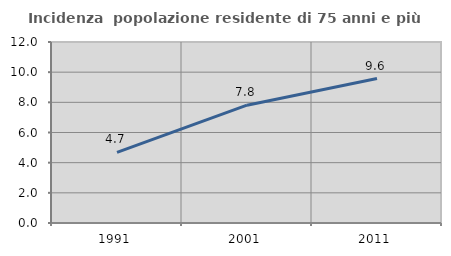
| Category | Incidenza  popolazione residente di 75 anni e più |
|---|---|
| 1991.0 | 4.683 |
| 2001.0 | 7.81 |
| 2011.0 | 9.577 |